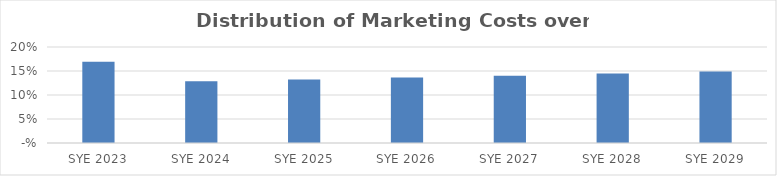
| Category | Series 0 |
|---|---|
| 2023.0 | 0.169 |
| 2024.0 | 0.128 |
| 2025.0 | 0.132 |
| 2026.0 | 0.136 |
| 2027.0 | 0.14 |
| 2028.0 | 0.145 |
| 2029.0 | 0.149 |